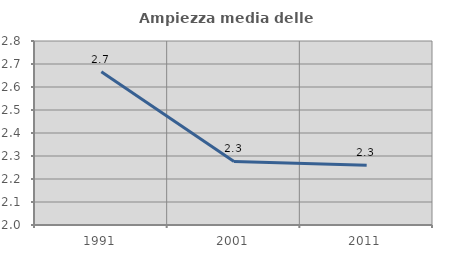
| Category | Ampiezza media delle famiglie |
|---|---|
| 1991.0 | 2.667 |
| 2001.0 | 2.277 |
| 2011.0 | 2.259 |